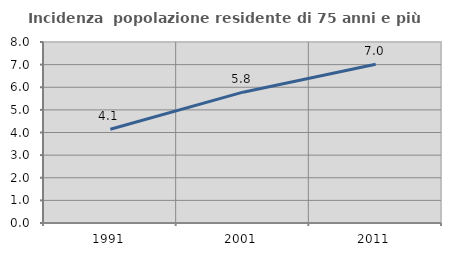
| Category | Incidenza  popolazione residente di 75 anni e più |
|---|---|
| 1991.0 | 4.146 |
| 2001.0 | 5.783 |
| 2011.0 | 7.016 |